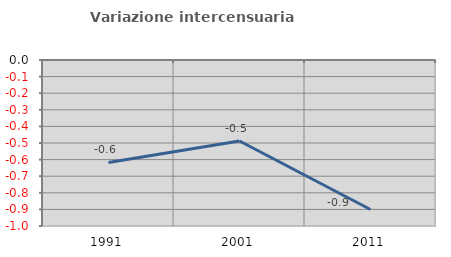
| Category | Variazione intercensuaria annua |
|---|---|
| 1991.0 | -0.617 |
| 2001.0 | -0.488 |
| 2011.0 | -0.901 |